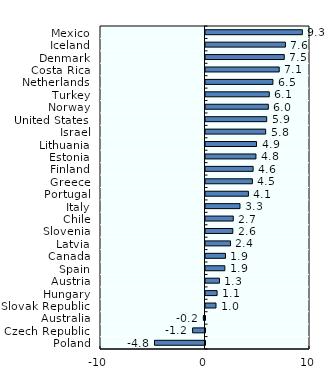
| Category | Real IRRs |
|---|---|
| Mexico | 9.268 |
| Iceland | 7.648 |
| Denmark | 7.537 |
| Costa Rica | 7.054 |
| Netherlands | 6.453 |
| Turkey | 6.102 |
| Norway | 6.015 |
| United States | 5.857 |
| Israel | 5.757 |
| Lithuania | 4.882 |
| Estonia | 4.827 |
| Finland | 4.558 |
| Greece | 4.486 |
| Portugal | 4.107 |
| Italy | 3.301 |
| Chile | 2.658 |
| Slovenia | 2.613 |
| Latvia | 2.391 |
| Canada | 1.913 |
| Spain | 1.852 |
| Austria | 1.337 |
| Hungary | 1.109 |
| Slovak Republic | 1.004 |
| Australia | -0.154 |
| Czech Republic | -1.187 |
| Poland | -4.832 |